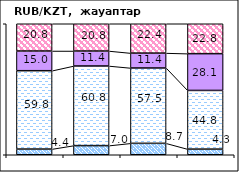
| Category | позитивно | не повлияло | негативно | не знаю |
|---|---|---|---|---|
| 0 | 4.35 | 59.81 | 15.03 | 20.81 |
| 1 | 6.98 | 60.77 | 11.43 | 20.82 |
| 2 | 8.73 | 57.5 | 11.36 | 22.41 |
| 3 | 4.31 | 44.79 | 28.07 | 22.83 |